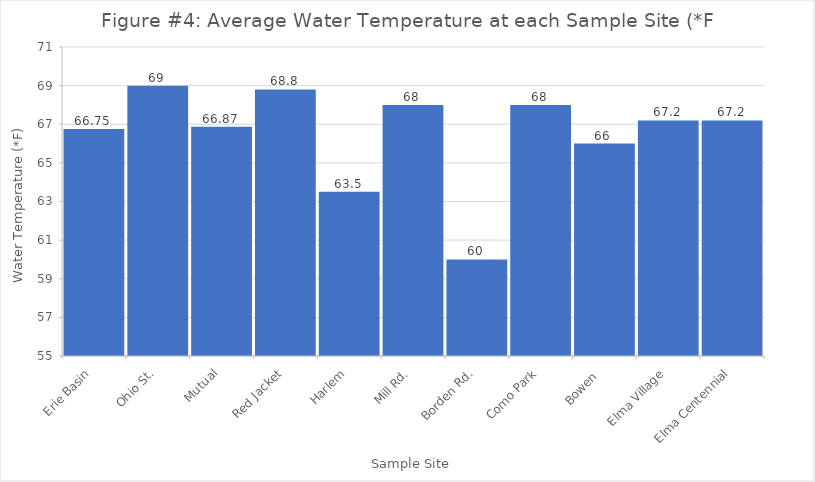
| Category | Series 0 |
|---|---|
| Erie Basin | 66.75 |
| Ohio St. | 69 |
| Mutual | 66.87 |
| Red Jacket | 68.8 |
| Harlem | 63.5 |
| Mill Rd. | 68 |
| Borden Rd. | 60 |
| Como Park | 68 |
| Bowen  | 66 |
| Elma Village | 67.2 |
| Elma Centennial | 67.2 |